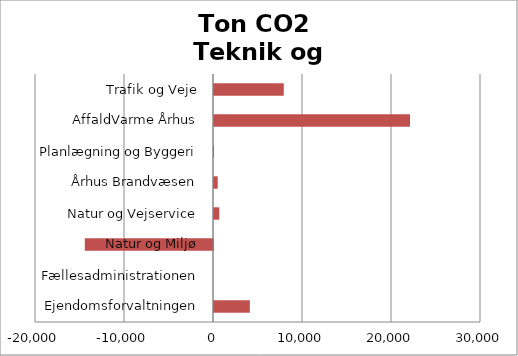
| Category | Series 0 | Series 1 |
|---|---|---|
| Ejendomsforvaltningen |  | 4023.912 |
| Fællesadministrationen |  | 0 |
| Natur og Miljø |  | -14402.781 |
| Natur og Vejservice |  | 595.766 |
| Århus Brandvæsen |  | 417.437 |
| Planlægning og Byggeri |  | 2.921 |
| AffaldVarme Århus |  | 22025.507 |
| Trafik og Veje |  | 7839.383 |